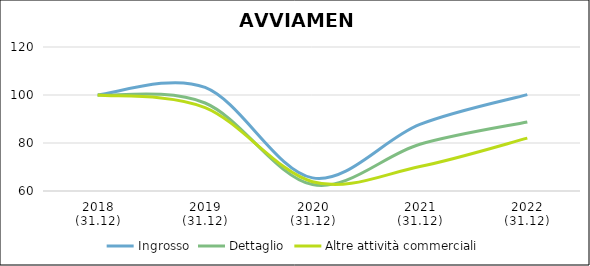
| Category | Ingrosso | Dettaglio | Altre attività commerciali |
|---|---|---|---|
| 2018
(31.12) | 100 | 100 | 100 |
| 2019
(31.12) | 103.142 | 96.669 | 94.762 |
| 2020
(31.12) | 65.468 | 62.67 | 63.878 |
| 2021
(31.12) | 87.755 | 79.477 | 70.211 |
| 2022
(31.12) | 100.162 | 88.765 | 82.017 |